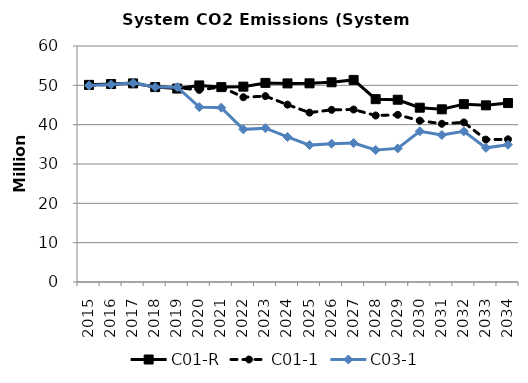
| Category | C01-R | C01-1 | C03-1 |
|---|---|---|---|
| 2015.0 | 50.118 | 49.98 | 49.98 |
| 2016.0 | 50.329 | 50.239 | 50.239 |
| 2017.0 | 50.499 | 50.623 | 50.593 |
| 2018.0 | 49.555 | 49.637 | 49.56 |
| 2019.0 | 49.181 | 49.422 | 49.523 |
| 2020.0 | 49.976 | 48.827 | 44.474 |
| 2021.0 | 49.548 | 49.578 | 44.323 |
| 2022.0 | 49.671 | 46.971 | 38.806 |
| 2023.0 | 50.618 | 47.262 | 39.113 |
| 2024.0 | 50.491 | 45.086 | 36.873 |
| 2025.0 | 50.508 | 43.063 | 34.801 |
| 2026.0 | 50.777 | 43.764 | 35.167 |
| 2027.0 | 51.38 | 43.847 | 35.328 |
| 2028.0 | 46.481 | 42.329 | 33.555 |
| 2029.0 | 46.342 | 42.511 | 33.965 |
| 2030.0 | 44.317 | 41.021 | 38.317 |
| 2031.0 | 43.901 | 40.228 | 37.368 |
| 2032.0 | 45.215 | 40.585 | 38.301 |
| 2033.0 | 44.915 | 36.207 | 34.11 |
| 2034.0 | 45.496 | 36.272 | 34.899 |